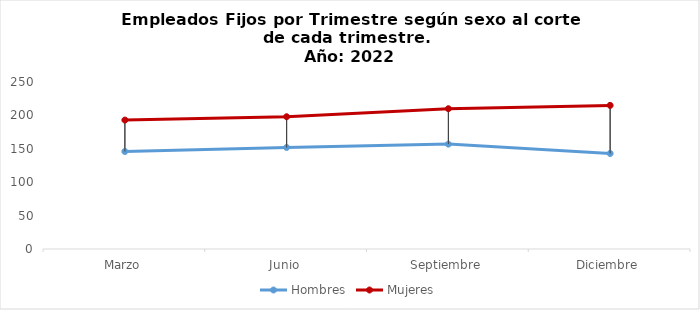
| Category | Hombres | Mujeres |
|---|---|---|
| Marzo | 146 | 193 |
| Junio | 152 | 198 |
| Septiembre | 157 | 210 |
| Diciembre | 143 | 215 |